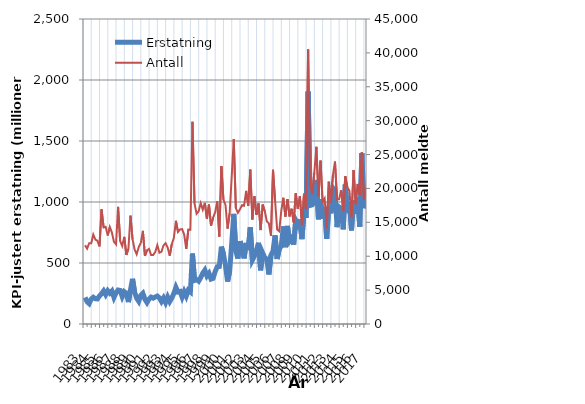
| Category | Erstatning |
|---|---|
| 1983.0 | 217.738 |
| nan | 182.39 |
| nan | 166.795 |
| nan | 204.317 |
| 1984.0 | 219.095 |
| nan | 207.248 |
| nan | 205.483 |
| nan | 229.834 |
| 1985.0 | 248.366 |
| nan | 271.471 |
| nan | 240.555 |
| nan | 272.822 |
| 1986.0 | 252.948 |
| nan | 270.665 |
| nan | 217.848 |
| nan | 254.933 |
| 1987.0 | 278.509 |
| nan | 274.837 |
| nan | 224.911 |
| nan | 264.614 |
| 1988.0 | 251.86 |
| nan | 179.537 |
| nan | 279.633 |
| nan | 370.436 |
| 1989.0 | 261.704 |
| nan | 211.52 |
| nan | 186.12 |
| nan | 234.811 |
| 1990.0 | 251.421 |
| nan | 202.269 |
| nan | 175.421 |
| nan | 204.183 |
| 1991.0 | 220.333 |
| nan | 211.849 |
| nan | 221.715 |
| nan | 229.225 |
| 1992.0 | 214.139 |
| nan | 184.514 |
| nan | 213.2 |
| nan | 175.933 |
| 1993.0 | 220.747 |
| nan | 183.711 |
| nan | 212.245 |
| nan | 251.093 |
| 1994.0 | 300.738 |
| nan | 262.914 |
| nan | 267.117 |
| nan | 220.171 |
| 1995.0 | 265.26 |
| nan | 228.202 |
| nan | 277.29 |
| nan | 263.273 |
| 1996.0 | 577.355 |
| nan | 357.508 |
| nan | 363.895 |
| nan | 350.948 |
| 1997.0 | 379.933 |
| nan | 416.911 |
| nan | 441.514 |
| nan | 393.933 |
| 1998.0 | 415.589 |
| nan | 368.173 |
| nan | 374.188 |
| nan | 430.086 |
| 1999.0 | 469.101 |
| nan | 471.379 |
| nan | 634.301 |
| nan | 574.443 |
| 2000.0 | 478.837 |
| nan | 347.74 |
| nan | 431.1 |
| nan | 657.294 |
| 2001.0 | 902.061 |
| nan | 597.168 |
| nan | 536.336 |
| nan | 678.575 |
| 2002.0 | 618.016 |
| nan | 537.735 |
| nan | 664.547 |
| nan | 605.551 |
| 2003.0 | 791.978 |
| nan | 523.627 |
| nan | 557.072 |
| nan | 606.848 |
| 2004.0 | 665.746 |
| nan | 440.146 |
| nan | 581.891 |
| nan | 543.889 |
| 2005.0 | 532.334 |
| nan | 406.244 |
| nan | 563.978 |
| nan | 597.674 |
| 2006.0 | 726.484 |
| nan | 532.776 |
| nan | 613.024 |
| nan | 639.554 |
| 2007.0 | 800.528 |
| nan | 629.384 |
| nan | 804.144 |
| nan | 679.889 |
| 2008.0 | 703.094 |
| nan | 650.888 |
| nan | 850.097 |
| nan | 816.43 |
| 2009.0 | 856.753 |
| nan | 695.547 |
| nan | 918.799 |
| nan | 868.457 |
| 2010.0 | 1905.043 |
| nan | 971.666 |
| nan | 976.341 |
| nan | 998.838 |
| 2011.0 | 1180.444 |
| nan | 858.391 |
| nan | 1023.5 |
| nan | 862.569 |
| 2012.0 | 955.608 |
| nan | 698.637 |
| nan | 963.225 |
| nan | 906.967 |
| 2013.0 | 1113.851 |
| nan | 1090.67 |
| nan | 793.622 |
| nan | 958.603 |
| 2014.0 | 945.44 |
| nan | 776.393 |
| nan | 1142.115 |
| nan | 913.19 |
| 2015.0 | 1001.888 |
| nan | 767.27 |
| nan | 1015.647 |
| nan | 901.778 |
| 2016.0 | 1036.665 |
| nan | 797.959 |
| nan | 1399.479 |
| nan | 949.547 |
| 2017.0 | 1017.751 |